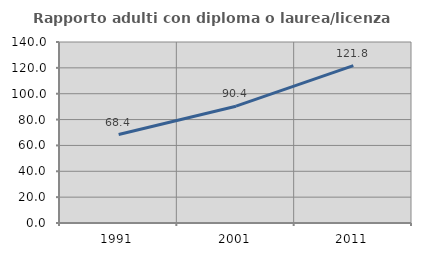
| Category | Rapporto adulti con diploma o laurea/licenza media  |
|---|---|
| 1991.0 | 68.397 |
| 2001.0 | 90.361 |
| 2011.0 | 121.784 |